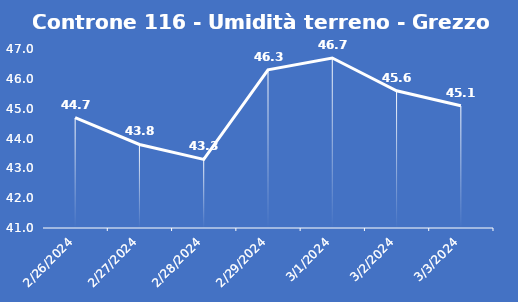
| Category | Controne 116 - Umidità terreno - Grezzo (%VWC) |
|---|---|
| 2/26/24 | 44.7 |
| 2/27/24 | 43.8 |
| 2/28/24 | 43.3 |
| 2/29/24 | 46.3 |
| 3/1/24 | 46.7 |
| 3/2/24 | 45.6 |
| 3/3/24 | 45.1 |